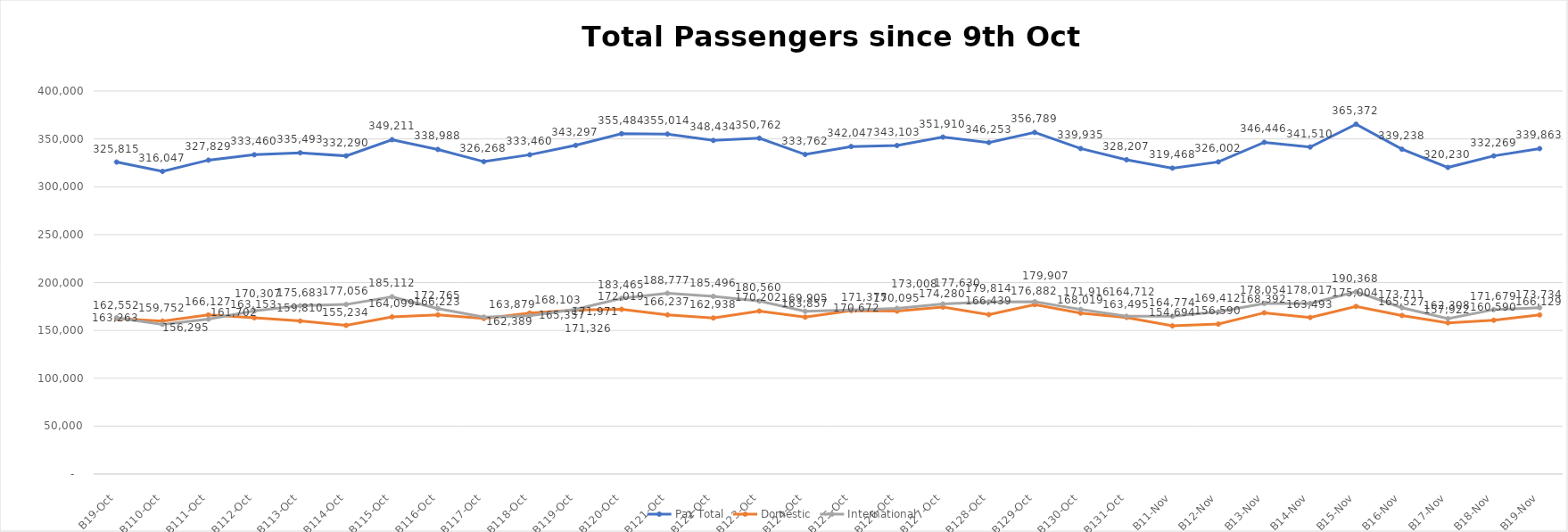
| Category | Pax Total | Domestic | International |
|---|---|---|---|
| 2023-10-09 | 325815 | 162552 | 163263 |
| 2023-10-10 | 316047 | 159752 | 156295 |
| 2023-10-11 | 327829 | 166127 | 161702 |
| 2023-10-12 | 333460 | 163153 | 170307 |
| 2023-10-13 | 335493 | 159810 | 175683 |
| 2023-10-14 | 332290 | 155234 | 177056 |
| 2023-10-15 | 349211 | 164099 | 185112 |
| 2023-10-16 | 338988 | 166223 | 172765 |
| 2023-10-17 | 326268 | 162389 | 163879 |
| 2023-10-18 | 333460 | 168103 | 165357 |
| 2023-10-19 | 343297 | 171326 | 171971 |
| 2023-10-20 | 355484 | 172019 | 183465 |
| 2023-10-21 | 355014 | 166237 | 188777 |
| 2023-10-22 | 348434 | 162938 | 185496 |
| 2023-10-23 | 350762 | 170202 | 180560 |
| 2023-10-24 | 333762 | 163857 | 169905 |
| 2023-10-25 | 342047 | 170672 | 171375 |
| 2023-10-26 | 343103 | 170095 | 173008 |
| 2023-10-27 | 351910 | 174280 | 177630 |
| 2023-10-28 | 346253 | 166439 | 179814 |
| 2023-10-29 | 356789 | 176882 | 179907 |
| 2023-10-30 | 339935 | 168019 | 171916 |
| 2023-10-31 | 328207 | 163495 | 164712 |
| 2023-11-01 | 319468 | 154694 | 164774 |
| 2023-11-02 | 326002 | 156590 | 169412 |
| 2023-11-03 | 346446 | 168392 | 178054 |
| 2023-11-04 | 341510 | 163493 | 178017 |
| 2023-11-05 | 365372 | 175004 | 190368 |
| 2023-11-06 | 339238 | 165527 | 173711 |
| 2023-11-07 | 320230 | 157922 | 162308 |
| 2023-11-08 | 332269 | 160590 | 171679 |
| 2023-11-09 | 339863 | 166129 | 173734 |